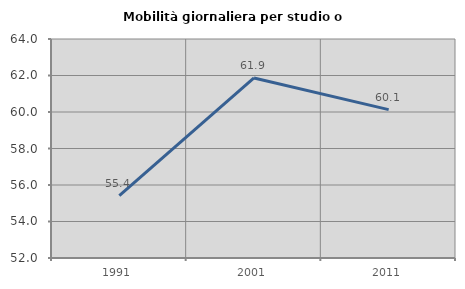
| Category | Mobilità giornaliera per studio o lavoro |
|---|---|
| 1991.0 | 55.42 |
| 2001.0 | 61.864 |
| 2011.0 | 60.131 |